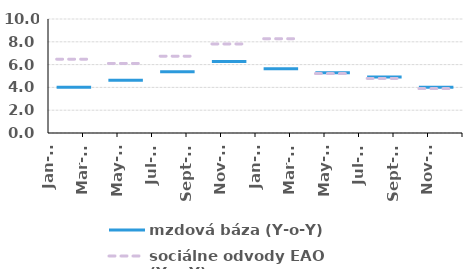
| Category | mzdová báza (Y-o-Y) | sociálne odvody EAO (Y-o-Y) |
|---|---|---|
| 2015-01-01 | 4.024 | 6.478 |
| 2015-02-01 | 4.024 | 6.478 |
| 2015-03-01 | 4.024 | 6.478 |
| 2015-04-01 | 4.631 | 6.102 |
| 2015-05-01 | 4.631 | 6.102 |
| 2015-06-01 | 4.631 | 6.102 |
| 2015-07-01 | 5.376 | 6.74 |
| 2015-08-01 | 5.376 | 6.74 |
| 2015-09-01 | 5.376 | 6.74 |
| 2015-10-01 | 6.273 | 7.817 |
| 2015-11-01 | 6.273 | 7.817 |
| 2015-12-01 | 6.273 | 7.817 |
| 2016-01-01 | 5.64 | 8.272 |
| 2016-02-01 | 5.64 | 8.272 |
| 2016-03-01 | 5.64 | 8.272 |
| 2016-04-01 | 5.275 | 5.213 |
| 2016-05-01 | 5.275 | 5.213 |
| 2016-06-01 | 5.275 | 5.213 |
| 2016-07-01 | 4.91 | 4.786 |
| 2016-08-01 | 4.91 | 4.786 |
| 2016-09-01 | 4.91 | 4.786 |
| 2016-10-01 | 4.02 | 3.899 |
| 2016-11-01 | 4.02 | 3.899 |
| 2016-12-01 | 4.02 | 3.899 |